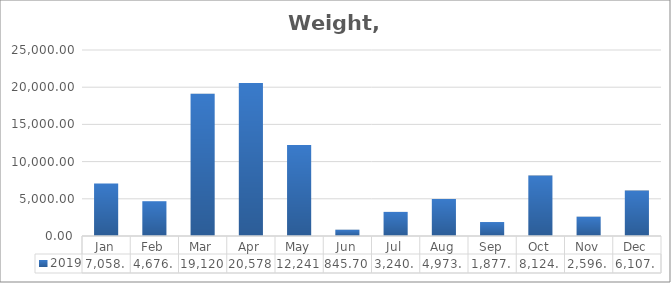
| Category | 2019 |
|---|---|
| Jan | 7058.597 |
| Feb | 4676.211 |
| Mar | 19120.025 |
| Apr | 20578.201 |
| May | 12241.579 |
| Jun | 845.703 |
| Jul | 3240.778 |
| Aug | 4973.562 |
| Sep | 1877.815 |
| Oct | 8124.126 |
| Nov | 2596.23 |
| Dec | 6107.389 |